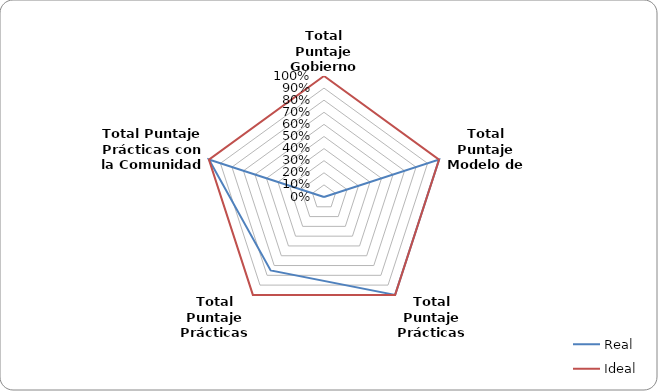
| Category | Real | Ideal |
|---|---|---|
| Total Puntaje Gobierno Corporativo | 0 | 1 |
| Total Puntaje Modelo de Negocio | 1 | 1 |
| Total Puntaje Prácticas Laborales | 1 | 1 |
| Total Puntaje Prácticas Ambientales | 0.75 | 1 |
| Total Puntaje Prácticas con la Comunidad | 1 | 1 |